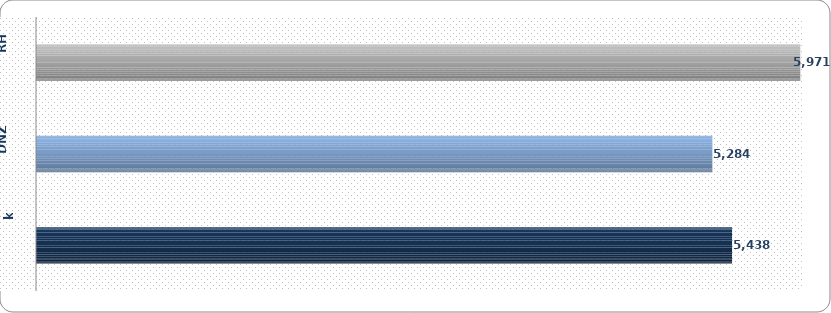
| Category | Series 0 |
|---|---|
| Dubrovnik | 5438 |
| DNŽ | 5284 |
| RH | 5971 |